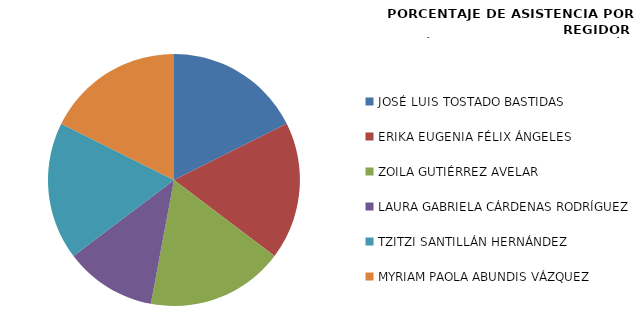
| Category | Series 0 |
|---|---|
| JOSÉ LUIS TOSTADO BASTIDAS | 100 |
| ERIKA EUGENIA FÉLIX ÁNGELES | 100 |
| ZOILA GUTIÉRREZ AVELAR | 100 |
| LAURA GABRIELA CÁRDENAS RODRÍGUEZ | 66.667 |
| TZITZI SANTILLÁN HERNÁNDEZ | 100 |
| MYRIAM PAOLA ABUNDIS VÁZQUEZ | 100 |